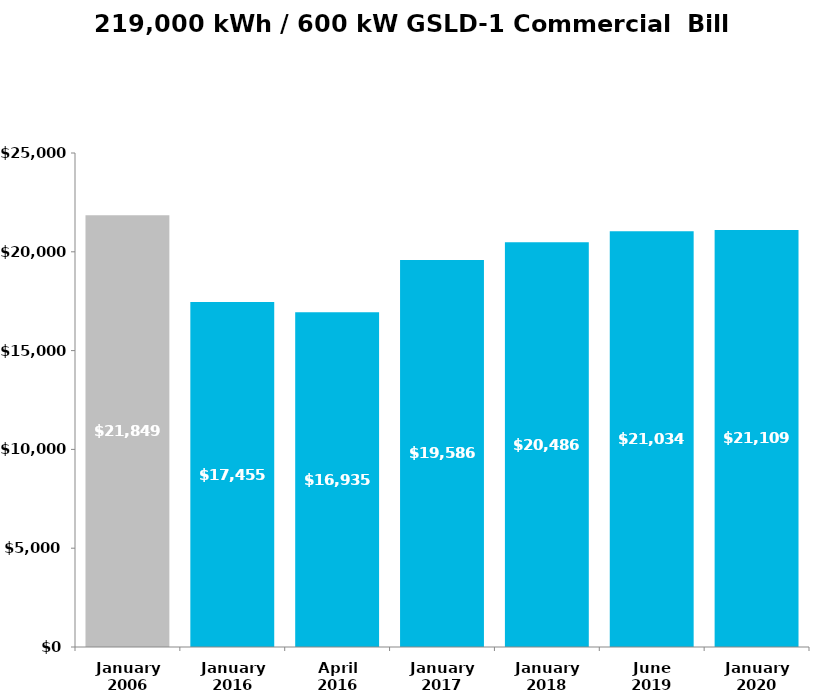
| Category | Total | Series 1 | Series 2 | Series 3 |
|---|---|---|---|---|
| January
2006 | 21849 |  |  |  |
| January
2016 | 17454.94 |  |  |  |
| April
2016 | 16935.38 |  |  |  |
| January
2017 | 19586.28 |  |  |  |
| January
2018 | 20486.49 |  |  |  |
| June
2019 | 21033.88 |  |  |  |
| January
2020 | 21108.68 |  |  |  |